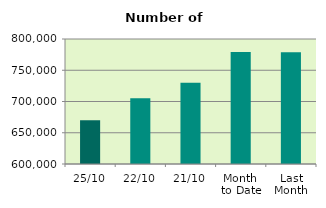
| Category | Series 0 |
|---|---|
| 25/10 | 670198 |
| 22/10 | 705032 |
| 21/10 | 729912 |
| Month 
to Date | 779223.294 |
| Last
Month | 778605.273 |